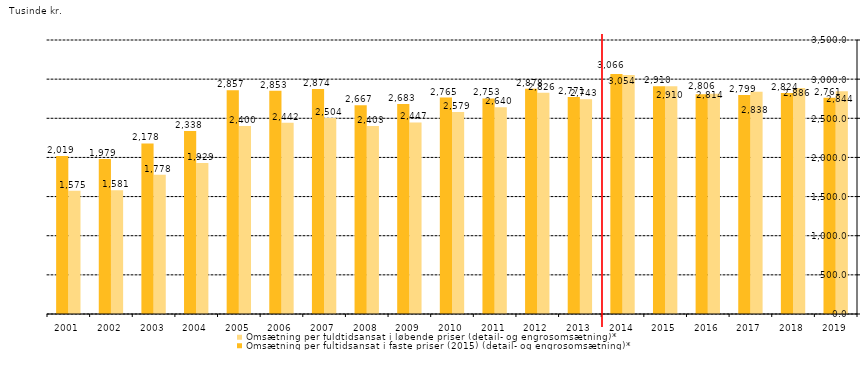
| Category | Omsætning per fuldtidsansat i løbende priser (detail- og engrosomsætning)* | Omsætning per fultidsansat i faste priser (2015) (detail- og engrosomsætning)* |
|---|---|---|
| 2019.0 | 2844 | 2761 |
| 2018.0 | 2886 | 2824 |
| 2017.0 | 2838 | 2799 |
| 2016.0 | 2814 | 2806 |
| 2015.0 | 2910 | 2910 |
| 2014.0 | 3054 | 3066 |
| 2013.0 | 2743 | 2771 |
| 2012.0 | 2826 | 2878 |
| 2011.0 | 2640 | 2753 |
| 2010.0 | 2579 | 2765 |
| 2009.0 | 2447 | 2683 |
| 2008.0 | 2403 | 2667 |
| 2007.0 | 2504 | 2874 |
| 2006.0 | 2442 | 2853 |
| 2005.0 | 2400 | 2857 |
| 2004.0 | 1929 | 2338 |
| 2003.0 | 1778 | 2178 |
| 2002.0 | 1581 | 1979 |
| 2001.0 | 1575 | 2019 |